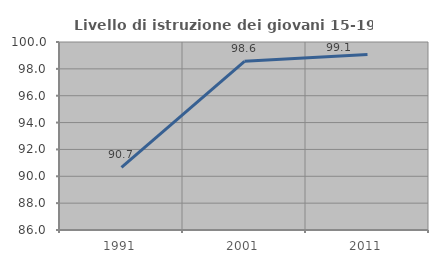
| Category | Livello di istruzione dei giovani 15-19 anni |
|---|---|
| 1991.0 | 90.672 |
| 2001.0 | 98.565 |
| 2011.0 | 99.07 |